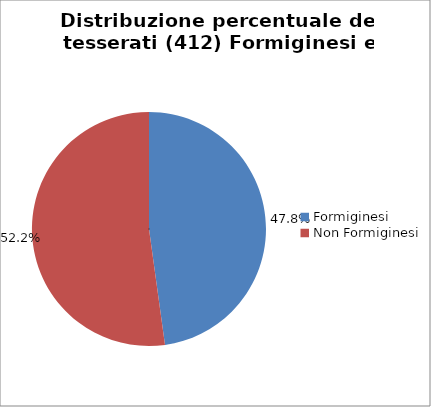
| Category | Nr. Tesserati |
|---|---|
| Formiginesi | 197 |
| Non Formiginesi | 215 |